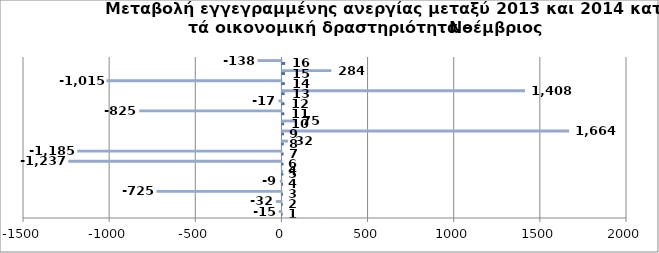
| Category | Series 0 | Series 1 |
|---|---|---|
| 0 | 1 | -15 |
| 1 | 2 | -32 |
| 2 | 3 | -725 |
| 3 | 4 | -9 |
| 4 | 5 | 4 |
| 5 | 6 | -1237 |
| 6 | 7 | -1185 |
| 7 | 8 | 32 |
| 8 | 9 | 1664 |
| 9 | 10 | 75 |
| 10 | 11 | -825 |
| 11 | 12 | -17 |
| 12 | 13 | 1408 |
| 13 | 14 | -1015 |
| 14 | 15 | 284 |
| 15 | 16 | -138 |